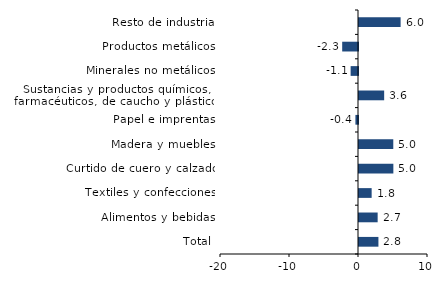
| Category | Series 0 |
|---|---|
| Total | 2.816 |
| Alimentos y bebidas | 2.703 |
| Textiles y confecciones | 1.833 |
| Curtido de cuero y calzado | 4.979 |
| Madera y muebles | 4.968 |
| Papel e imprentas | -0.375 |
| Sustancias y productos químicos, farmacéuticos, de caucho y plásticos | 3.647 |
| Minerales no metálicos | -1.068 |
| Productos metálicos | -2.291 |
| Resto de industria | 6.032 |